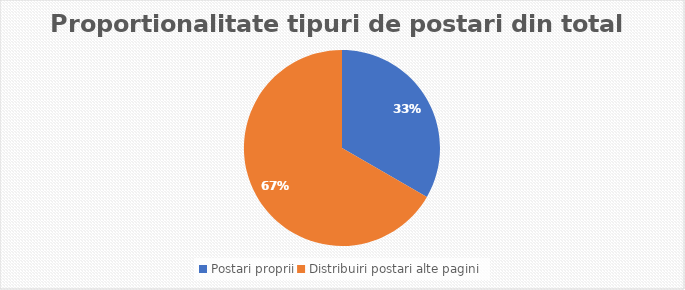
| Category | Series 0 |
|---|---|
| Postari proprii | 17 |
| Distribuiri postari alte pagini | 34 |